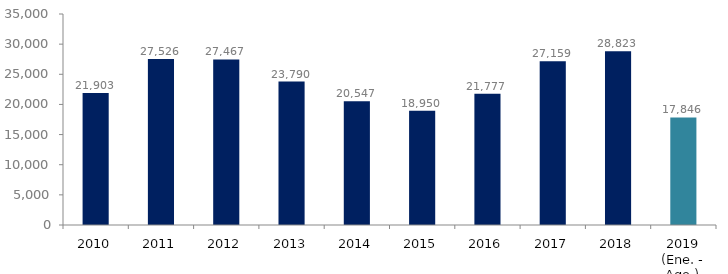
| Category | Series 1 |
|---|---|
| 2010 | 21903 |
| 2011 | 27526 |
| 2012 | 27467 |
| 2013 | 23790 |
| 2014 | 20547 |
| 2015 | 18950.14 |
| 2016 | 21776.636 |
| 2017 | 27158.582 |
| 2018 | 28823.486 |
| 2019 (Ene. - Ago.) | 17845.621 |